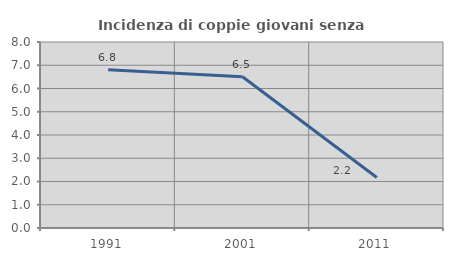
| Category | Incidenza di coppie giovani senza figli |
|---|---|
| 1991.0 | 6.805 |
| 2001.0 | 6.502 |
| 2011.0 | 2.169 |